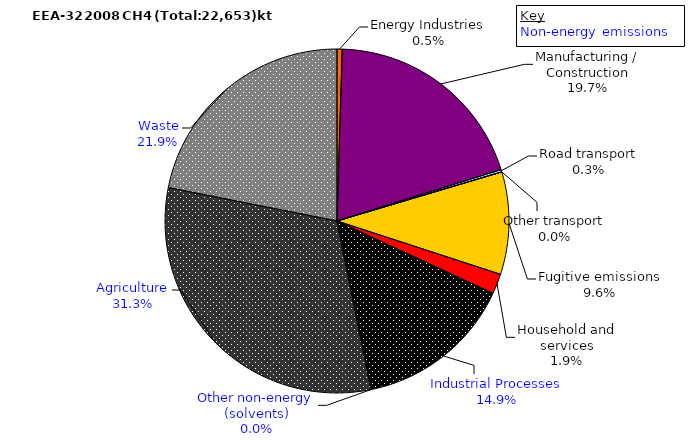
| Category | Series 0 |
|---|---|
| Energy Industries | 163.602 |
| Manufacturing / Construction | 6666.782 |
| Road transport | 75.94 |
| Other transport | 1.965 |
| Fugitive emissions | 3259.066 |
| Household and services | 642.074 |
| Industrial Processes | 5049.332 |
| Other non-energy (solvents) | 5.592 |
| Agriculture | 10595.804 |
| Waste | 7414.524 |